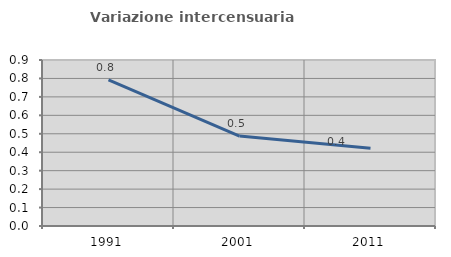
| Category | Variazione intercensuaria annua |
|---|---|
| 1991.0 | 0.793 |
| 2001.0 | 0.487 |
| 2011.0 | 0.421 |